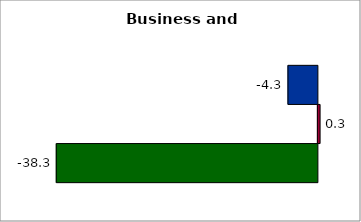
| Category | 50 states and D.C. | SREB states | State |
|---|---|---|---|
| 0 | -4.316 | 0.32 | -38.289 |